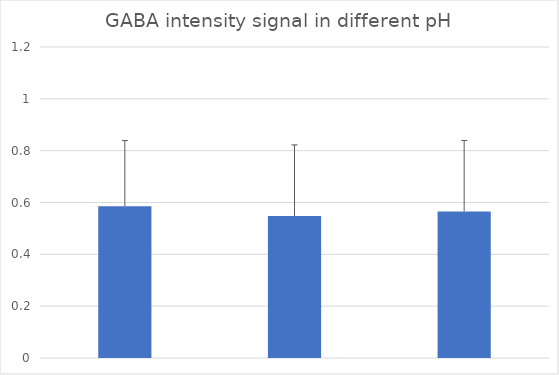
| Category | Series 0 |
|---|---|
| 0 | 0.585 |
| 1 | 0.548 |
| 2 | 0.566 |